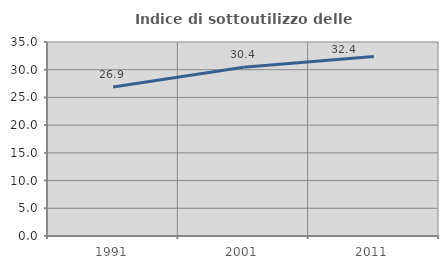
| Category | Indice di sottoutilizzo delle abitazioni  |
|---|---|
| 1991.0 | 26.891 |
| 2001.0 | 30.435 |
| 2011.0 | 32.376 |